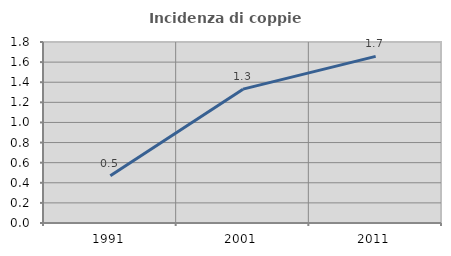
| Category | Incidenza di coppie miste |
|---|---|
| 1991.0 | 0.469 |
| 2001.0 | 1.331 |
| 2011.0 | 1.657 |